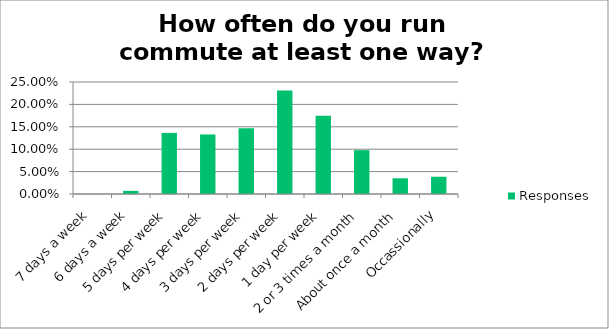
| Category | Responses |
|---|---|
| 7 days a week | 0 |
| 6 days a week | 0.007 |
| 5 days per week | 0.136 |
| 4 days per week | 0.133 |
| 3 days per week | 0.147 |
| 2 days per week | 0.231 |
| 1 day per week | 0.175 |
| 2 or 3 times a month | 0.098 |
| About once a month | 0.035 |
| Occassionally | 0.038 |